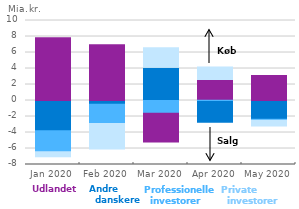
| Category | Andre danskere | Professionelle investorer | Udlandet | Private investorer |
|---|---|---|---|---|
| 2020-01-01 | -3.772 | -2.627 | 7.836 | -0.773 |
| 2020-02-01 | -0.461 | -2.424 | 6.959 | -3.304 |
| 2020-03-01 | 4.044 | -1.589 | -3.587 | 2.557 |
| 2020-04-01 | -2.712 | 0.15 | 2.335 | 1.691 |
| 2020-05-01 | -2.342 | -0.131 | 3.135 | -0.826 |